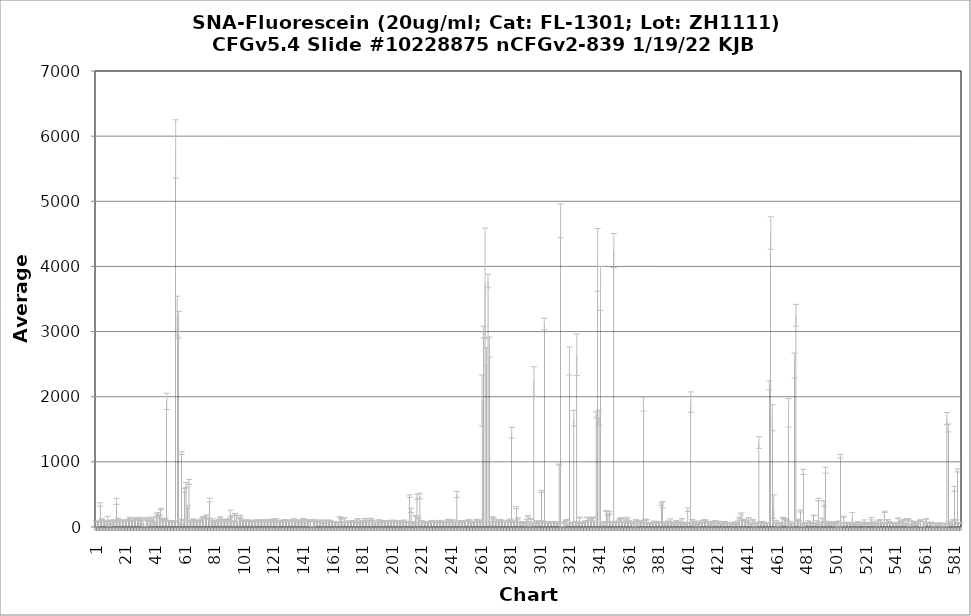
| Category | Average RFU |
|---|---|
| 1.0 | 50.75 |
| 2.0 | 77.5 |
| 3.0 | 88.25 |
| 4.0 | 345.25 |
| 5.0 | 120.5 |
| 6.0 | 99 |
| 7.0 | 83.75 |
| 8.0 | 78.75 |
| 9.0 | 99.25 |
| 10.0 | 52.75 |
| 11.0 | 98.25 |
| 12.0 | 67.5 |
| 13.0 | 97.5 |
| 14.0 | 90.25 |
| 15.0 | 393.75 |
| 16.0 | 110 |
| 17.0 | 109.75 |
| 18.0 | 96.25 |
| 19.0 | 89 |
| 20.0 | 91.5 |
| 21.0 | 95.75 |
| 22.0 | 105.75 |
| 23.0 | 105.5 |
| 24.0 | 142.5 |
| 25.0 | 96.75 |
| 26.0 | 94.75 |
| 27.0 | 114 |
| 28.0 | 126 |
| 29.0 | 131.25 |
| 30.0 | 130.75 |
| 31.0 | 94.75 |
| 32.0 | 103.25 |
| 33.0 | 59.5 |
| 34.0 | 10.75 |
| 35.0 | 132 |
| 36.0 | 98.5 |
| 37.0 | 120.25 |
| 38.0 | 112.25 |
| 39.0 | 109.75 |
| 40.0 | 96 |
| 41.0 | 76.75 |
| 42.0 | 175.75 |
| 43.0 | 201.5 |
| 44.0 | 176.5 |
| 45.0 | 276 |
| 46.0 | 90 |
| 47.0 | 121.75 |
| 48.0 | 127 |
| 49.0 | 1928.75 |
| 50.0 | 88.5 |
| 51.0 | 97.25 |
| 52.0 | 86.5 |
| 53.0 | 82 |
| 54.0 | 87.75 |
| 55.0 | 5804 |
| 56.0 | 3236.5 |
| 57.0 | 3105.25 |
| 58.0 | 78.25 |
| 59.0 | 1135 |
| 60.0 | 109.5 |
| 61.0 | 561.5 |
| 62.0 | 646.75 |
| 63.0 | 313 |
| 64.0 | 693 |
| 65.0 | 93.25 |
| 66.0 | 79.5 |
| 67.0 | 119 |
| 68.0 | 100.75 |
| 69.0 | 83 |
| 70.0 | 97.75 |
| 71.0 | 90 |
| 72.0 | 105.75 |
| 73.0 | 136.75 |
| 74.0 | 158.25 |
| 75.0 | 129.75 |
| 76.0 | 179 |
| 77.0 | 130.75 |
| 78.0 | 412.5 |
| 79.0 | 96.75 |
| 80.0 | 80.75 |
| 81.0 | 59 |
| 82.0 | 76.75 |
| 83.0 | 91.5 |
| 84.0 | 108.75 |
| 85.0 | 147 |
| 86.0 | 90 |
| 87.0 | 84.75 |
| 88.0 | 118.25 |
| 89.0 | 109.25 |
| 90.0 | 86.25 |
| 91.0 | 119.25 |
| 92.0 | 206.75 |
| 93.0 | 170.5 |
| 94.0 | 90.75 |
| 95.0 | 207.25 |
| 96.0 | 177.75 |
| 97.0 | 85 |
| 98.0 | 136.5 |
| 99.0 | 159.25 |
| 100.0 | 104 |
| 101.0 | 90.5 |
| 102.0 | 101.5 |
| 103.0 | 84.25 |
| 104.0 | 105 |
| 105.0 | 98.25 |
| 106.0 | 78.75 |
| 107.0 | 91.75 |
| 108.0 | 41.25 |
| 109.0 | 107.5 |
| 110.0 | 81.25 |
| 111.0 | 86.5 |
| 112.0 | 97.25 |
| 113.0 | 100.5 |
| 114.0 | 91 |
| 115.0 | 110 |
| 116.0 | 93.75 |
| 117.0 | 78.75 |
| 118.0 | 101.25 |
| 119.0 | 99.5 |
| 120.0 | 72 |
| 121.0 | 119 |
| 122.0 | 85.25 |
| 123.0 | 117.75 |
| 124.0 | 24 |
| 125.0 | 95.25 |
| 126.0 | 74.25 |
| 127.0 | 88.5 |
| 128.0 | 99.5 |
| 129.0 | 103.75 |
| 130.0 | 106 |
| 131.0 | 97 |
| 132.0 | 86 |
| 133.0 | 96.5 |
| 134.0 | 98.75 |
| 135.0 | 121.75 |
| 136.0 | 83.5 |
| 137.0 | 92.75 |
| 138.0 | 81.5 |
| 139.0 | 102.25 |
| 140.0 | 87 |
| 141.0 | 129 |
| 142.0 | 107.5 |
| 143.0 | 92.5 |
| 144.0 | 81 |
| 145.0 | 99.75 |
| 146.0 | 108.25 |
| 147.0 | 3.75 |
| 148.0 | 80.25 |
| 149.0 | 103.25 |
| 150.0 | 97.5 |
| 151.0 | 85.5 |
| 152.0 | 78.75 |
| 153.0 | 104 |
| 154.0 | 61.25 |
| 155.0 | 102 |
| 156.0 | 72.5 |
| 157.0 | 93.5 |
| 158.0 | 105.5 |
| 159.0 | 100 |
| 160.0 | 88 |
| 161.0 | 75.5 |
| 162.0 | 79.25 |
| 163.0 | 76.25 |
| 164.0 | 78.5 |
| 165.0 | 71 |
| 166.0 | 152.75 |
| 167.0 | 127 |
| 168.0 | 76.5 |
| 169.0 | 139.75 |
| 170.0 | 85 |
| 171.0 | 74 |
| 172.0 | 82 |
| 173.0 | 87.75 |
| 174.0 | 81.25 |
| 175.0 | 92.75 |
| 176.0 | 76 |
| 177.0 | 64 |
| 178.0 | 125.5 |
| 179.0 | 70.5 |
| 180.0 | 81.25 |
| 181.0 | 94 |
| 182.0 | 86 |
| 183.0 | 126.75 |
| 184.0 | 67.75 |
| 185.0 | 100.75 |
| 186.0 | 96.75 |
| 187.0 | 129 |
| 188.0 | 96.25 |
| 189.0 | 66 |
| 190.0 | 69.5 |
| 191.0 | 66.5 |
| 192.0 | 104.25 |
| 193.0 | 74.5 |
| 194.0 | 101 |
| 195.0 | 82 |
| 196.0 | 93.25 |
| 197.0 | 84 |
| 198.0 | 92 |
| 199.0 | 88.25 |
| 200.0 | 68.5 |
| 201.0 | 94 |
| 202.0 | 90.5 |
| 203.0 | 95 |
| 204.0 | 80 |
| 205.0 | 95 |
| 206.0 | 68.25 |
| 207.0 | 92.25 |
| 208.0 | 87.25 |
| 209.0 | 101.25 |
| 210.0 | 72 |
| 211.0 | 84.5 |
| 212.0 | 72.5 |
| 213.0 | 474 |
| 214.0 | 252.5 |
| 215.0 | 75.5 |
| 216.0 | 60 |
| 217.0 | 170 |
| 218.0 | 464.25 |
| 219.0 | 141 |
| 220.0 | 476 |
| 221.0 | 92.25 |
| 222.0 | 83.5 |
| 223.0 | 65 |
| 224.0 | 75.25 |
| 225.0 | 65.25 |
| 226.0 | 81.5 |
| 227.0 | 73.25 |
| 228.0 | 97.5 |
| 229.0 | 73.5 |
| 230.0 | 83.25 |
| 231.0 | 69 |
| 232.0 | 89.5 |
| 233.0 | 98.25 |
| 234.0 | 67.25 |
| 235.0 | 77.75 |
| 236.0 | 83.5 |
| 237.0 | 88.75 |
| 238.0 | 70.25 |
| 239.0 | 112.5 |
| 240.0 | 81 |
| 241.0 | 92 |
| 242.0 | 108 |
| 243.0 | 73.75 |
| 244.0 | 79.75 |
| 245.0 | 498.5 |
| 246.0 | 85 |
| 247.0 | 91 |
| 248.0 | 66.5 |
| 249.0 | 88 |
| 250.0 | 89.75 |
| 251.0 | 97.75 |
| 252.0 | 92.75 |
| 253.0 | 112 |
| 254.0 | 59.25 |
| 255.0 | 87.25 |
| 256.0 | 80.5 |
| 257.0 | 73.5 |
| 258.0 | 114.5 |
| 259.0 | 85.25 |
| 260.0 | 70.25 |
| 261.0 | 104.75 |
| 262.0 | 1942 |
| 263.0 | 2994 |
| 264.0 | 3740.5 |
| 265.0 | 2617.25 |
| 266.0 | 3774.25 |
| 267.0 | 2761.75 |
| 268.0 | 84 |
| 269.0 | 148.5 |
| 270.0 | 128 |
| 271.0 | 79.5 |
| 272.0 | 86 |
| 273.0 | 98 |
| 274.0 | 103.75 |
| 275.0 | 104.5 |
| 276.0 | 76.5 |
| 277.0 | 84 |
| 278.0 | 86.75 |
| 279.0 | 79.75 |
| 280.0 | 102.25 |
| 281.0 | 113.75 |
| 282.0 | 1446.75 |
| 283.0 | 89 |
| 284.0 | 68.5 |
| 285.0 | 297.75 |
| 286.0 | 131.25 |
| 287.0 | 86 |
| 288.0 | 73 |
| 289.0 | 77 |
| 290.0 | 58.75 |
| 291.0 | 67.5 |
| 292.0 | 99 |
| 293.0 | 164.25 |
| 294.0 | 45.75 |
| 295.0 | 125 |
| 296.0 | 57.5 |
| 297.0 | 2234.25 |
| 298.0 | 59.5 |
| 299.0 | 92 |
| 300.0 | 87 |
| 301.0 | 70.5 |
| 302.0 | 545.75 |
| 303.0 | 91.5 |
| 304.0 | 3116.5 |
| 305.0 | 63.5 |
| 306.0 | 63.5 |
| 307.0 | 77.5 |
| 308.0 | 65.5 |
| 309.0 | 77 |
| 310.0 | 58.25 |
| 311.0 | 69.75 |
| 312.0 | 76.25 |
| 313.0 | 58.5 |
| 314.0 | 957.25 |
| 315.0 | 4701.75 |
| 316.0 | 1.75 |
| 317.0 | 60 |
| 318.0 | 85.25 |
| 319.0 | 107.5 |
| 320.0 | 54 |
| 321.0 | 2547.25 |
| 322.0 | 64.75 |
| 323.0 | 69 |
| 324.0 | 1670.25 |
| 325.0 | 80.5 |
| 326.0 | 2643.5 |
| 327.0 | 61.5 |
| 328.0 | 146 |
| 329.0 | 50.75 |
| 330.0 | 72.75 |
| 331.0 | 71.75 |
| 332.0 | 90.5 |
| 333.0 | 147.75 |
| 334.0 | 97 |
| 335.0 | 126.5 |
| 336.0 | 116.75 |
| 337.0 | 148 |
| 338.0 | 81.75 |
| 339.0 | 1721.5 |
| 340.0 | 4099.5 |
| 341.0 | 1682.75 |
| 342.0 | 3664.25 |
| 343.0 | 74.25 |
| 344.0 | 67.25 |
| 345.0 | 78.5 |
| 346.0 | 245.25 |
| 347.0 | 184.5 |
| 348.0 | 219.25 |
| 349.0 | 76.25 |
| 350.0 | 72.25 |
| 351.0 | 4244.5 |
| 352.0 | 75 |
| 353.0 | 78.75 |
| 354.0 | 87.75 |
| 355.0 | 121 |
| 356.0 | 135.5 |
| 357.0 | 72.75 |
| 358.0 | 65.25 |
| 359.0 | 102 |
| 360.0 | 135.75 |
| 361.0 | 91.25 |
| 362.0 | 72.5 |
| 363.0 | 64.75 |
| 364.0 | 83.75 |
| 365.0 | 26 |
| 366.0 | 108.75 |
| 367.0 | 91.5 |
| 368.0 | 90 |
| 369.0 | 94.5 |
| 370.0 | 66.5 |
| 371.0 | 1887.25 |
| 372.0 | 108.25 |
| 373.0 | 109.5 |
| 374.0 | 59 |
| 375.0 | 58.5 |
| 376.0 | 53.5 |
| 377.0 | 58 |
| 378.0 | 84.25 |
| 379.0 | 77 |
| 380.0 | 65.25 |
| 381.0 | 79.75 |
| 382.0 | 76.5 |
| 383.0 | 352 |
| 384.0 | 345 |
| 385.0 | 51.75 |
| 386.0 | 57.25 |
| 387.0 | 64.75 |
| 388.0 | 88.25 |
| 389.0 | 101.5 |
| 390.0 | 65.5 |
| 391.0 | 62.25 |
| 392.0 | 57 |
| 393.0 | 95 |
| 394.0 | 75.5 |
| 395.0 | 58.25 |
| 396.0 | 80.75 |
| 397.0 | 126.5 |
| 398.0 | 55.25 |
| 399.0 | 66.75 |
| 400.0 | 62.75 |
| 401.0 | 267.25 |
| 402.0 | 66 |
| 403.0 | 1917.25 |
| 404.0 | 72.75 |
| 405.0 | 87.75 |
| 406.0 | 59.5 |
| 407.0 | 36.75 |
| 408.0 | 65.25 |
| 409.0 | 75.25 |
| 410.0 | 65.5 |
| 411.0 | 80.75 |
| 412.0 | 108 |
| 413.0 | 101.25 |
| 414.0 | 78.25 |
| 415.0 | 83.25 |
| 416.0 | 44.75 |
| 417.0 | 68 |
| 418.0 | 58.25 |
| 419.0 | 93.5 |
| 420.0 | 75.75 |
| 421.0 | 83 |
| 422.0 | 83.75 |
| 423.0 | 49.5 |
| 424.0 | 46.25 |
| 425.0 | 67 |
| 426.0 | 80.5 |
| 427.0 | 58.5 |
| 428.0 | 57.5 |
| 429.0 | 53.75 |
| 430.0 | 58.75 |
| 431.0 | 44 |
| 432.0 | 39.5 |
| 433.0 | 58.5 |
| 434.0 | 65.75 |
| 435.0 | 49.25 |
| 436.0 | 142 |
| 437.0 | 201 |
| 438.0 | 101.25 |
| 439.0 | 109.5 |
| 440.0 | 88.75 |
| 441.0 | 80.25 |
| 442.0 | 139.25 |
| 443.0 | 57.5 |
| 444.0 | 54.5 |
| 445.0 | 105 |
| 446.0 | 35.25 |
| 447.0 | 64.25 |
| 448.0 | 62.25 |
| 449.0 | 1296.75 |
| 450.0 | 77.75 |
| 451.0 | 82 |
| 452.0 | 71 |
| 453.0 | 54.75 |
| 454.0 | 61.75 |
| 455.0 | 50 |
| 456.0 | 2174.25 |
| 457.0 | 4512.5 |
| 458.0 | 1678.5 |
| 459.0 | 314.25 |
| 460.0 | 63.5 |
| 461.0 | 84.75 |
| 462.0 | 33.25 |
| 463.0 | 61.25 |
| 464.0 | 42.5 |
| 465.0 | 147.75 |
| 466.0 | 124.25 |
| 467.0 | 127.75 |
| 468.0 | 107 |
| 469.0 | 1752.25 |
| 470.0 | 47.25 |
| 471.0 | 57.5 |
| 472.0 | 22.25 |
| 473.0 | 2478 |
| 474.0 | 3249.25 |
| 475.0 | 111.75 |
| 476.0 | 96 |
| 477.0 | 245.5 |
| 478.0 | 31.75 |
| 479.0 | 845.75 |
| 480.0 | 56.75 |
| 481.0 | 57.25 |
| 482.0 | 82.5 |
| 483.0 | 61 |
| 484.0 | 49.75 |
| 485.0 | 65.5 |
| 486.0 | 178.25 |
| 487.0 | 62.75 |
| 488.0 | 64 |
| 489.0 | 420.75 |
| 490.0 | 17.75 |
| 491.0 | 71 |
| 492.0 | 131.75 |
| 493.0 | 359.75 |
| 494.0 | 870.75 |
| 495.0 | 56.5 |
| 496.0 | 66.5 |
| 497.0 | 73.25 |
| 498.0 | 46.25 |
| 499.0 | 58.25 |
| 500.0 | 54.75 |
| 501.0 | 76.75 |
| 502.0 | 35 |
| 503.0 | 47 |
| 504.0 | 1085.75 |
| 505.0 | 28.25 |
| 506.0 | 156.5 |
| 507.0 | 25.5 |
| 508.0 | 60.25 |
| 509.0 | 59.25 |
| 510.0 | 60.25 |
| 511.0 | 66.25 |
| 512.0 | 133.25 |
| 513.0 | 44.25 |
| 514.0 | 66.75 |
| 515.0 | 51 |
| 516.0 | 79 |
| 517.0 | 52.5 |
| 518.0 | 41.5 |
| 519.0 | 51.75 |
| 520.0 | 89 |
| 521.0 | 21.75 |
| 522.0 | 54 |
| 523.0 | 69.75 |
| 524.0 | 48.75 |
| 525.0 | 126.5 |
| 526.0 | 49.5 |
| 527.0 | 72.75 |
| 528.0 | 53.25 |
| 529.0 | 34.75 |
| 530.0 | 100.75 |
| 531.0 | 105.75 |
| 532.0 | 53.75 |
| 533.0 | 58.25 |
| 534.0 | 233 |
| 535.0 | 61 |
| 536.0 | 111.5 |
| 537.0 | 75.5 |
| 538.0 | 66 |
| 539.0 | 61.75 |
| 540.0 | 61.5 |
| 541.0 | 68 |
| 542.0 | 52.5 |
| 543.0 | 132.5 |
| 544.0 | 57 |
| 545.0 | 87.25 |
| 546.0 | 82.25 |
| 547.0 | 110.5 |
| 548.0 | 49 |
| 549.0 | 117.25 |
| 550.0 | 123 |
| 551.0 | 19 |
| 552.0 | 90 |
| 553.0 | 48 |
| 554.0 | 69.75 |
| 555.0 | 51.5 |
| 556.0 | 55 |
| 557.0 | 87.5 |
| 558.0 | 107 |
| 559.0 | 3.75 |
| 560.0 | 85.75 |
| 561.0 | 19.25 |
| 562.0 | 122.75 |
| 563.0 | 60.75 |
| 564.0 | 61 |
| 565.0 | 73.5 |
| 566.0 | 60 |
| 567.0 | 9 |
| 568.0 | 51.5 |
| 569.0 | 53.5 |
| 570.0 | 50.25 |
| 571.0 | 58.5 |
| 572.0 | 29 |
| 573.0 | 10 |
| 574.0 | 54.25 |
| 575.0 | 29.25 |
| 576.0 | 1662.5 |
| 577.0 | 1519.75 |
| 578.0 | 75.25 |
| 579.0 | 46.75 |
| 580.0 | 103.5 |
| 581.0 | 586 |
| 582.0 | 110.5 |
| 583.0 | 868.75 |
| 584.0 | 60 |
| 585.0 | 58.75 |